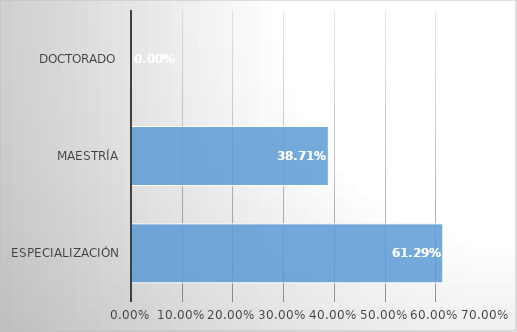
| Category | Series 0 |
|---|---|
| Especialización | 0.613 |
| Maestría | 0.387 |
| Doctorado | 0 |